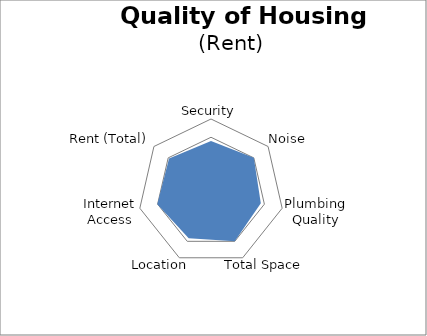
| Category | Rental Ranking |
|---|---|
| Security | 70 |
| Noise | 75 |
| Plumbing Quality | 70 |
| Total Space | 75.065 |
| Location | 70.469 |
| Internet Access | 75.427 |
| Rent (Total) | 73.529 |